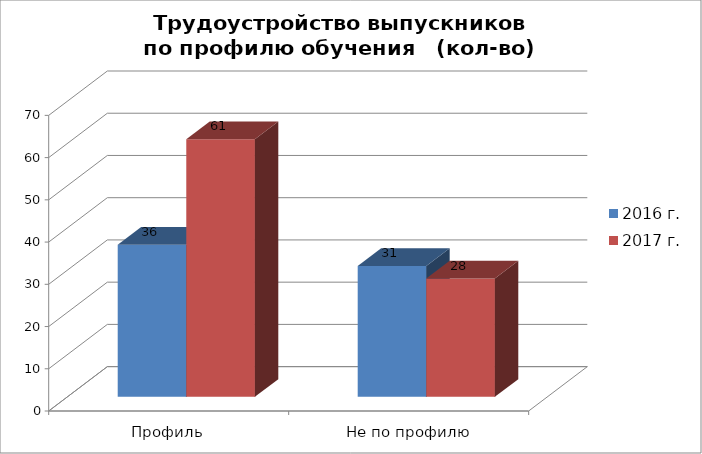
| Category | 2016 г. | 2017 г. |
|---|---|---|
| Профиль | 36 | 61 |
| Не по профилю | 31 | 28 |